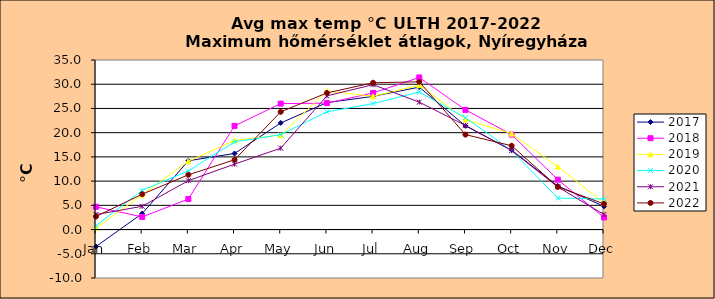
| Category | 2017 | 2018 | 2019 | 2020 | 2021 | 2022 |
|---|---|---|---|---|---|---|
| Jan | -3.5 | 4.7 | 0.3 | 0.8 | 3.1 | 2.7 |
| Feb | 3.3 | 2.6 | 7.2 | 8.1 | 4.8 | 7.3 |
| Mar | 14.2 | 6.3 | 14.1 | 12.1 | 10.1 | 11.3 |
| Apr | 15.7 | 21.4 | 18.4 | 18.1 | 13.5 | 14.4 |
| May | 22 | 26 | 19.5 | 19.6 | 16.8 | 24.3 |
| Jun | 26.2 | 26.1 | 28.6 | 24.3 | 27.6 | 28.2 |
| Jul | 27.5 | 28.2 | 27.5 | 26 | 29.9 | 30.3 |
| Aug | 29.4 | 31.4 | 29.8 | 28.4 | 26.3 | 30.5 |
| Sep | 21.4 | 24.7 | 22.7 | 23.1 | 21.5 | 19.6 |
| Oct | 16.4 | 19.6 | 19.8 | 16.3 | 16.3 | 17.3 |
| Nov | 9 | 10.3 | 13 | 6.5 | 8.8 | 8.8 |
| Dec | 4.8 | 2.5 | 5.5 | 6.3 | 3.1 | 5.3 |